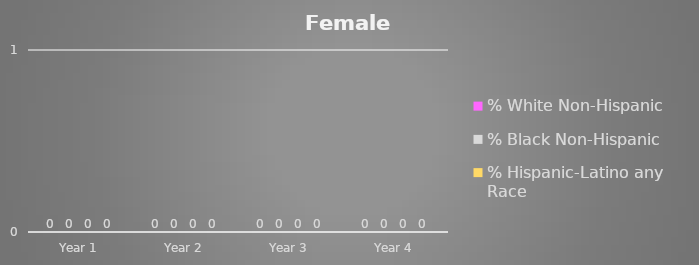
| Category | Series 1 | Series 2 | Series 3 | Series 4 |
|---|---|---|---|---|
| Year 1 | 0 | 0 | 0 | 0 |
| Year 2 | 0 | 0 | 0 | 0 |
| Year 3 | 0 | 0 | 0 | 0 |
| Year 4 | 0 | 0 | 0 | 0 |